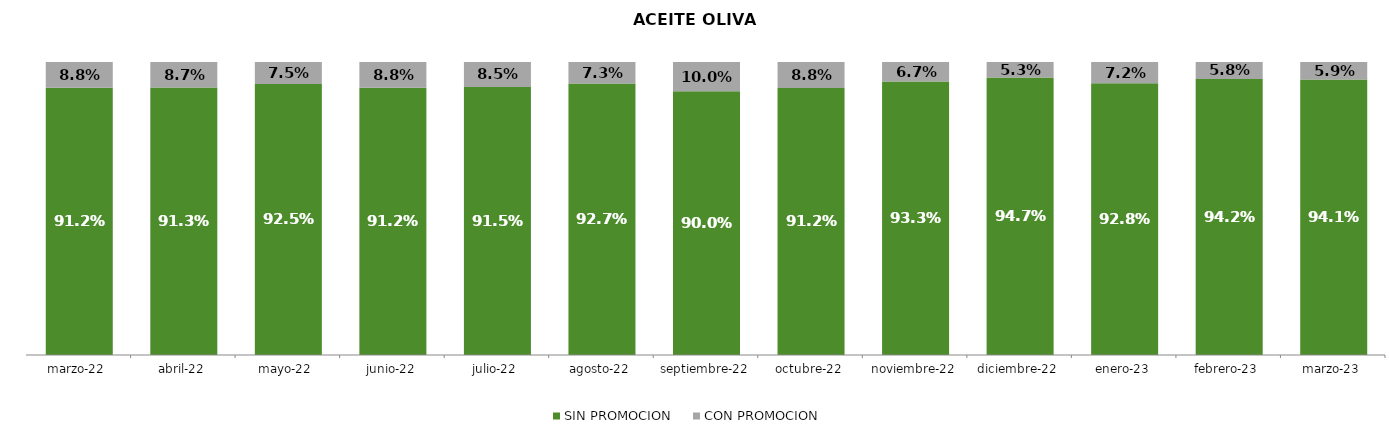
| Category | SIN PROMOCION   | CON PROMOCION   |
|---|---|---|
| 2022-03-01 | 0.912 | 0.088 |
| 2022-04-01 | 0.913 | 0.087 |
| 2022-05-01 | 0.925 | 0.075 |
| 2022-06-01 | 0.912 | 0.088 |
| 2022-07-01 | 0.915 | 0.085 |
| 2022-08-01 | 0.927 | 0.073 |
| 2022-09-01 | 0.9 | 0.1 |
| 2022-10-01 | 0.912 | 0.088 |
| 2022-11-01 | 0.933 | 0.067 |
| 2022-12-01 | 0.947 | 0.053 |
| 2023-01-01 | 0.928 | 0.072 |
| 2023-02-01 | 0.942 | 0.058 |
| 2023-03-01 | 0.941 | 0.059 |